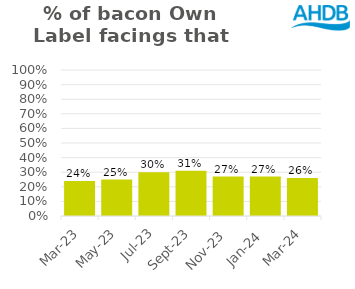
| Category | Bacon |
|---|---|
| 2023-03-01 | 0.24 |
| 2023-05-01 | 0.25 |
| 2023-07-01 | 0.3 |
| 2023-09-01 | 0.31 |
| 2023-11-01 | 0.27 |
| 2024-01-01 | 0.27 |
| 2024-03-01 | 0.26 |